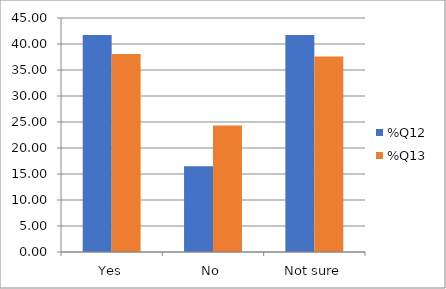
| Category | %Q12 | %Q13 |
|---|---|---|
| Yes | 41.743 | 38.073 |
| No | 16.514 | 24.312 |
| Not sure | 41.743 | 37.615 |